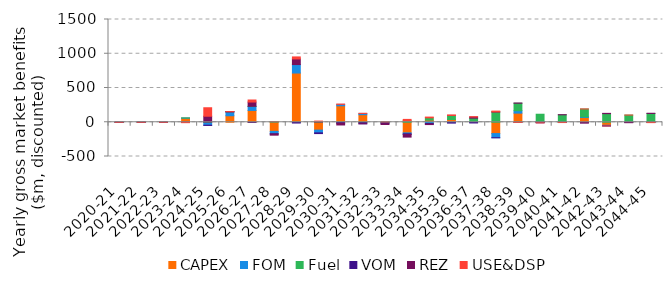
| Category | CAPEX | FOM | Fuel | VOM | REZ | USE&DSP |
|---|---|---|---|---|---|---|
| 2020-21 | -0.028 | -0.007 | 0 | 0 | -0.002 | -0.001 |
| 2021-22 | -0.001 | 0 | 0 | 0 | 0 | -0.001 |
| 2022-23 | -0.017 | -0.002 | 0 | 0 | 0 | 0 |
| 2023-24 | 59.391 | 2.499 | 0.521 | -0.089 | 0 | -5.974 |
| 2024-25 | 1.552 | -43.088 | 1.308 | -3.018 | 85.066 | 123.885 |
| 2025-26 | 94.8 | 57.787 | 0.116 | 0.903 | 0 | 1.603 |
| 2026-27 | 172.505 | 58.517 | 1.411 | -1.173 | 62.541 | 29.787 |
| 2027-28 | -133.212 | -36.062 | 6.606 | -1.452 | -17.742 | 1.12 |
| 2028-29 | 718.453 | 123.752 | -2.051 | -9.527 | 81.871 | 29.612 |
| 2029-30 | -114.829 | -39.947 | 3.605 | -10.678 | 4.825 | 8.682 |
| 2030-31 | 239.94 | 20.563 | -2.313 | -13.781 | -23.674 | 4.916 |
| 2031-32 | 110.105 | 18.272 | -4.637 | -17.59 | 0 | 2.426 |
| 2032-33 | 4.08 | -6.048 | -0.587 | -15.372 | -11.29 | 2.587 |
| 2033-34 | -154.847 | -13.678 | 21.461 | -10.342 | -38.118 | 20.17 |
| 2034-35 | 30.733 | -18.515 | 34.036 | -9.273 | -6.135 | 10.617 |
| 2035-36 | 39.706 | -4.705 | 59.591 | -7.589 | 0 | 7.354 |
| 2036-37 | 7.075 | -1.837 | 53.024 | -8.63 | 16.42 | 4.838 |
| 2037-38 | -165.195 | -60.824 | 149.12 | -0.501 | 2.578 | 11.02 |
| 2038-39 | 133.272 | 35.075 | 109.302 | -2.806 | 2.993 | -0.022 |
| 2039-40 | 6.185 | 3.634 | 107.256 | -4.9 | -3.185 | -0.046 |
| 2040-41 | 4.969 | -0.303 | 103.843 | -3.148 | 1.488 | -1.045 |
| 2041-42 | 69.05 | 9.954 | 114.229 | -4.752 | -8.194 | 0.932 |
| 2042-43 | -44.883 | -7.354 | 125.652 | -1.684 | 4.138 | -0.632 |
| 2043-44 | 1.51 | -0.61 | 103.405 | -1.118 | -4.778 | 0.096 |
| 2044-45 | 2.806 | 0.994 | 124.546 | -1.006 | 2.589 | -4.434 |